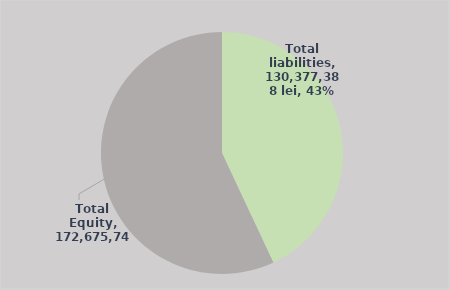
| Category | Series 0 |
|---|---|
| Total liabilities | 130377387.572 |
| Total Equity | 172675743.601 |